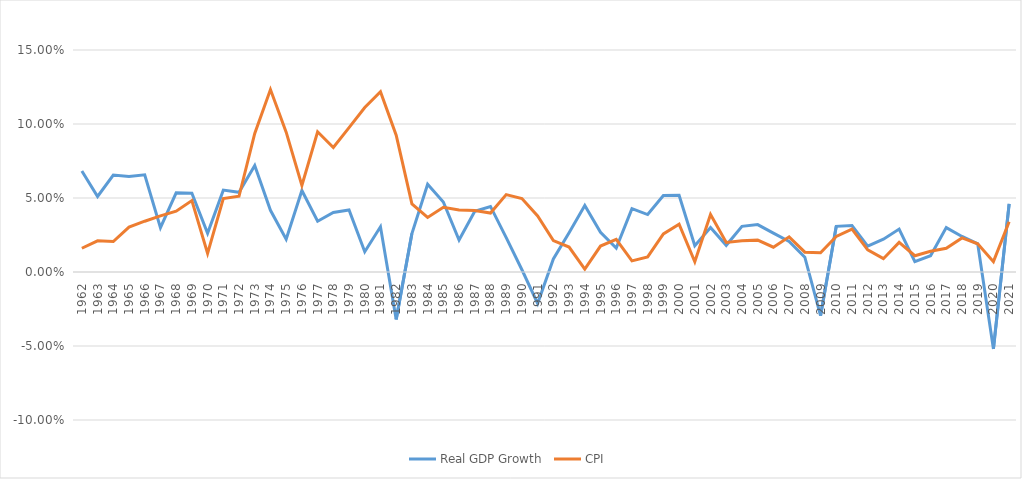
| Category | Real GDP Growth | CPI  |
|---|---|---|
| 1962.0 | 0.068 | 0.016 |
| 1963.0 | 0.051 | 0.021 |
| 1964.0 | 0.066 | 0.021 |
| 1965.0 | 0.065 | 0.03 |
| 1966.0 | 0.066 | 0.034 |
| 1967.0 | 0.03 | 0.038 |
| 1968.0 | 0.053 | 0.041 |
| 1969.0 | 0.053 | 0.048 |
| 1970.0 | 0.026 | 0.013 |
| 1971.0 | 0.055 | 0.05 |
| 1972.0 | 0.054 | 0.051 |
| 1973.0 | 0.072 | 0.094 |
| 1974.0 | 0.042 | 0.123 |
| 1975.0 | 0.022 | 0.095 |
| 1976.0 | 0.055 | 0.058 |
| 1977.0 | 0.034 | 0.095 |
| 1978.0 | 0.04 | 0.084 |
| 1979.0 | 0.042 | 0.098 |
| 1980.0 | 0.014 | 0.111 |
| 1981.0 | 0.031 | 0.122 |
| 1982.0 | -0.032 | 0.092 |
| 1983.0 | 0.026 | 0.046 |
| 1984.0 | 0.059 | 0.037 |
| 1985.0 | 0.047 | 0.044 |
| 1986.0 | 0.022 | 0.042 |
| 1987.0 | 0.041 | 0.042 |
| 1988.0 | 0.044 | 0.04 |
| 1989.0 | 0.023 | 0.052 |
| 1990.0 | 0.002 | 0.05 |
| 1991.0 | -0.021 | 0.038 |
| 1992.0 | 0.009 | 0.021 |
| 1993.0 | 0.027 | 0.017 |
| 1994.0 | 0.045 | 0.002 |
| 1995.0 | 0.027 | 0.018 |
| 1996.0 | 0.016 | 0.022 |
| 1997.0 | 0.043 | 0.007 |
| 1998.0 | 0.039 | 0.01 |
| 1999.0 | 0.052 | 0.026 |
| 2000.0 | 0.052 | 0.032 |
| 2001.0 | 0.018 | 0.007 |
| 2002.0 | 0.03 | 0.039 |
| 2003.0 | 0.018 | 0.02 |
| 2004.0 | 0.031 | 0.021 |
| 2005.0 | 0.032 | 0.022 |
| 2006.0 | 0.026 | 0.017 |
| 2007.0 | 0.021 | 0.024 |
| 2008.0 | 0.01 | 0.013 |
| 2009.0 | -0.029 | 0.013 |
| 2010.0 | 0.031 | 0.024 |
| 2011.0 | 0.031 | 0.029 |
| 2012.0 | 0.017 | 0.015 |
| 2013.0 | 0.022 | 0.009 |
| 2014.0 | 0.029 | 0.02 |
| 2015.0 | 0.007 | 0.011 |
| 2016.0 | 0.011 | 0.014 |
| 2017.0 | 0.03 | 0.016 |
| 2018.0 | 0.024 | 0.023 |
| 2019.0 | 0.019 | 0.019 |
| 2020.0 | -0.052 | 0.007 |
| 2021.0 | 0.046 | 0.034 |